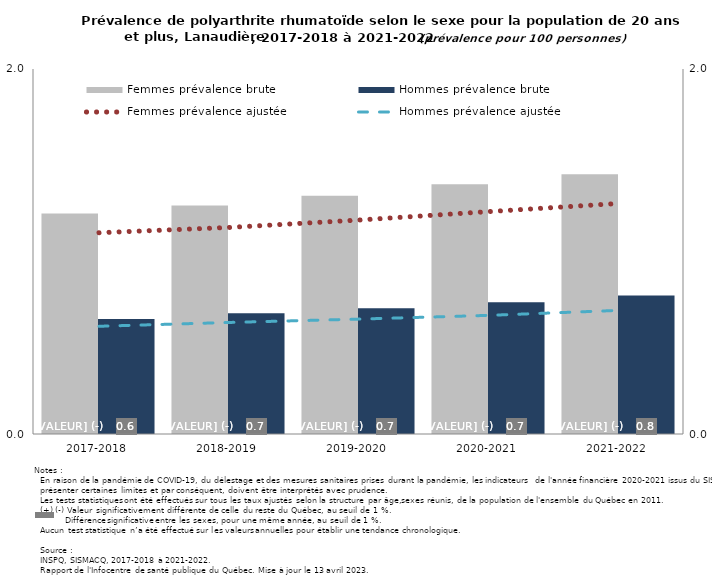
| Category | Femmes prévalence brute | Hommes prévalence brute |
|---|---|---|
| 2017-2018 | 1.208 | 0.63 |
| 2018-2019 | 1.252 | 0.661 |
| 2019-2020 | 1.305 | 0.689 |
| 2020-2021 | 1.368 | 0.723 |
| 2021-2022 | 1.423 | 0.759 |